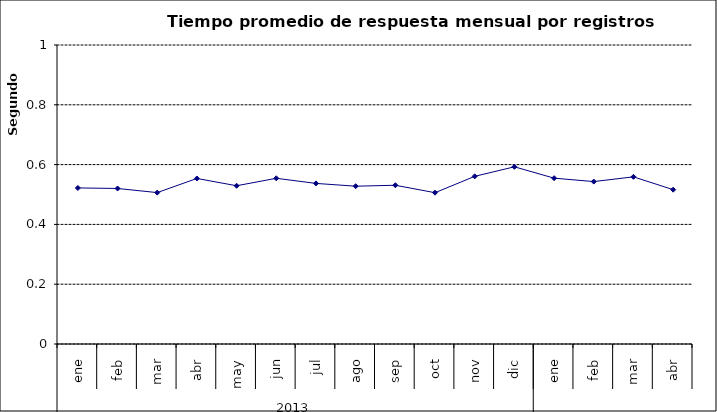
| Category | Tiempo promedio de respuesta por registros cámara PH ** |
|---|---|
| 0 | 0.522 |
| 1 | 0.52 |
| 2 | 0.506 |
| 3 | 0.554 |
| 4 | 0.529 |
| 5 | 0.554 |
| 6 | 0.537 |
| 7 | 0.528 |
| 8 | 0.531 |
| 9 | 0.506 |
| 10 | 0.561 |
| 11 | 0.593 |
| 12 | 0.555 |
| 13 | 0.543 |
| 14 | 0.559 |
| 15 | 0.516 |